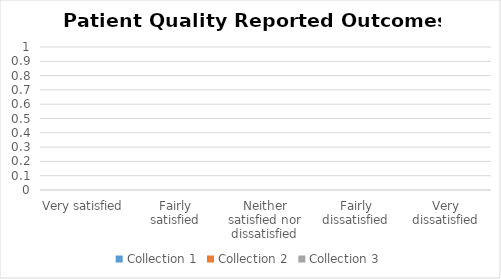
| Category | Collection 1 | Collection 2 | Collection 3 |
|---|---|---|---|
| Very satisfied | 0 | 0 | 0 |
| Fairly satisfied | 0 | 0 | 0 |
| Neither satisfied nor dissatisfied | 0 | 0 | 0 |
| Fairly dissatisfied | 0 | 0 | 0 |
| Very dissatisfied | 0 | 0 | 0 |